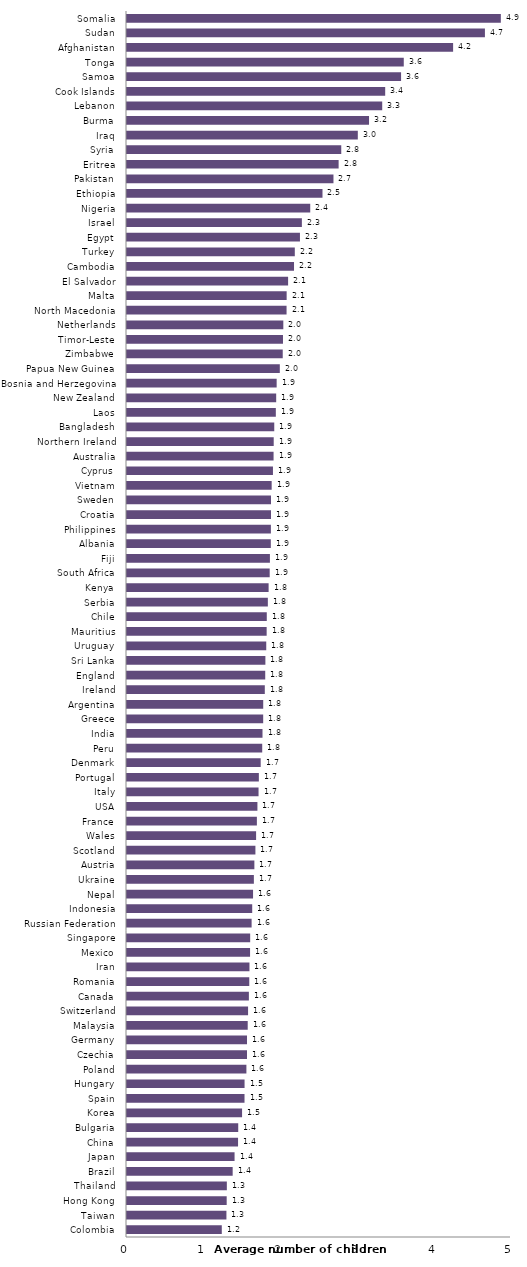
| Category | Series 0 |
|---|---|
| Colombia | 1.234 |
| Taiwan | 1.295 |
| Hong Kong | 1.298 |
| Thailand | 1.3 |
| Brazil | 1.376 |
| Japan | 1.401 |
| China | 1.446 |
| Bulgaria | 1.448 |
| Korea | 1.498 |
| Spain | 1.53 |
| Hungary | 1.531 |
| Poland | 1.555 |
| Czechia | 1.562 |
| Germany | 1.563 |
| Malaysia | 1.572 |
| Switzerland | 1.576 |
| Canada | 1.587 |
| Romania | 1.592 |
| Iran | 1.595 |
| Mexico | 1.602 |
| Singapore | 1.604 |
| Russian Federation | 1.623 |
| Indonesia | 1.63 |
| Nepal | 1.641 |
| Ukraine | 1.652 |
| Austria | 1.659 |
| Scotland | 1.672 |
| Wales | 1.681 |
| France | 1.691 |
| USA | 1.698 |
| Italy | 1.713 |
| Portugal | 1.717 |
| Denmark | 1.741 |
| Peru | 1.761 |
| India | 1.764 |
| Greece | 1.773 |
| Argentina | 1.774 |
| Ireland | 1.794 |
| England | 1.8 |
| Sri Lanka | 1.802 |
| Uruguay | 1.813 |
| Mauritius | 1.818 |
| Chile | 1.82 |
| Serbia | 1.834 |
| Kenya | 1.844 |
| South Africa | 1.858 |
| Fiji | 1.861 |
| Albania | 1.873 |
| Philippines | 1.874 |
| Croatia | 1.875 |
| Sweden | 1.875 |
| Vietnam | 1.884 |
| Cyprus | 1.901 |
| Australia | 1.908 |
| Northern Ireland | 1.91 |
| Bangladesh | 1.917 |
| Laos | 1.938 |
| New Zealand | 1.943 |
| Bosnia and Herzegovina | 1.949 |
| Papua New Guinea | 1.99 |
| Zimbabwe | 2.028 |
| Timor-Leste | 2.031 |
| Netherlands | 2.035 |
| North Macedonia | 2.078 |
| Malta | 2.079 |
| El Salvador | 2.098 |
| Cambodia | 2.175 |
| Turkey | 2.185 |
| Egypt | 2.252 |
| Israel | 2.277 |
| Nigeria | 2.386 |
| Ethiopia | 2.545 |
| Pakistan | 2.688 |
| Eritrea | 2.756 |
| Syria | 2.79 |
| Iraq | 3.005 |
| Burma | 3.152 |
| Lebanon | 3.323 |
| Cook Islands | 3.362 |
| Samoa | 3.569 |
| Tonga | 3.604 |
| Afghanistan | 4.246 |
| Sudan | 4.66 |
| Somalia | 4.868 |